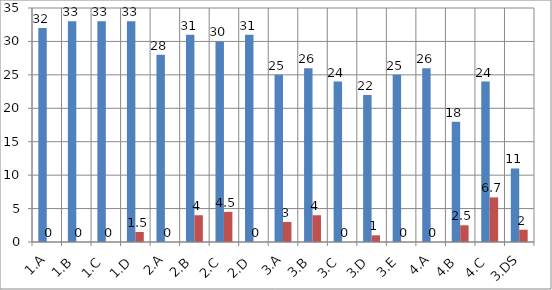
| Category | Series 0 | Series 1 |
|---|---|---|
| 1.A | 32 | 0 |
| 1.B | 33 | 0 |
| 1.C | 33 | 0 |
| 1.D | 33 | 1.5 |
| 2.A | 28 | 0 |
| 2.B | 31 | 4 |
| 2.C | 30 | 4.5 |
| 2.D | 31 | 0 |
| 3.A | 25 | 3 |
| 3.B | 26 | 4 |
| 3.C | 24 | 0 |
| 3.D | 22 | 1 |
| 3.E | 25 | 0 |
| 4.A | 26 | 0 |
| 4.B | 18 | 2.5 |
| 4.C | 24 | 6.667 |
| 3.DS | 11 | 1.833 |